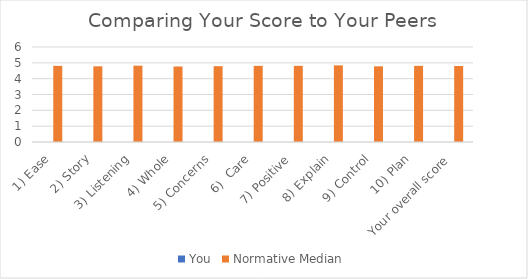
| Category | You | Normative Median |
|---|---|---|
| 1) Ease | 0 | 4.81 |
| 2) Story | 0 | 4.78 |
| 3) Listening | 0 | 4.82 |
| 4) Whole | 0 | 4.77 |
| 5) Concerns | 0 | 4.79 |
| 6)  Care | 0 | 4.81 |
| 7) Positive | 0 | 4.81 |
| 8) Explain | 0 | 4.84 |
| 9) Control | 0 | 4.78 |
| 10) Plan | 0 | 4.81 |
| Your overall score | 0 | 4.8 |